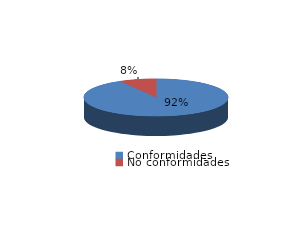
| Category | Series 0 |
|---|---|
| Conformidades | 753 |
| No conformidades | 67 |